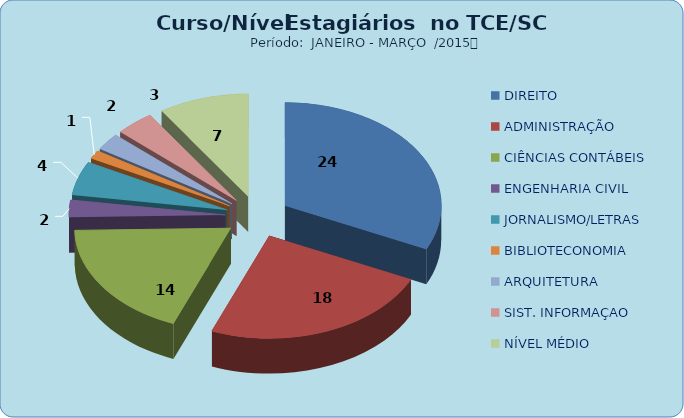
| Category | Series 0 |
|---|---|
| DIREITO | 24 |
| ADMINISTRAÇÃO | 18 |
| CIÊNCIAS CONTÁBEIS | 14 |
| ENGENHARIA CIVIL | 2 |
| JORNALISMO/LETRAS | 4 |
| BIBLIOTECONOMIA | 1 |
| ARQUITETURA | 2 |
| SIST. INFORMAÇAO | 3 |
| NÍVEL MÉDIO | 7 |